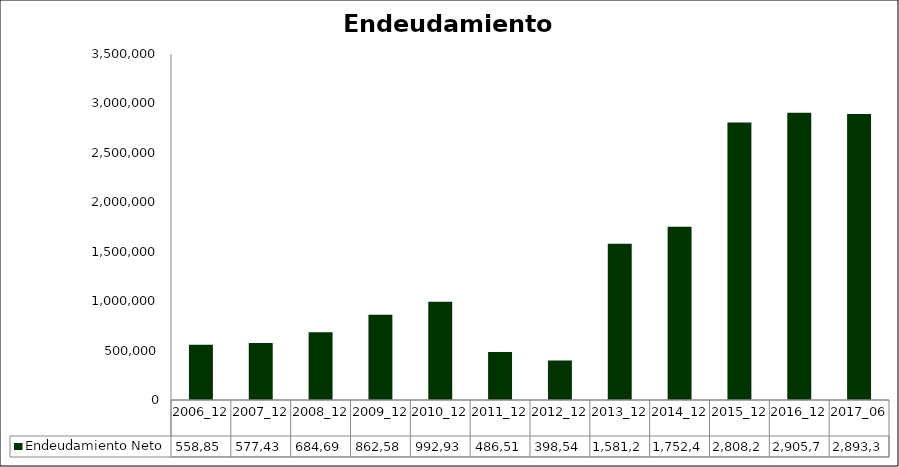
| Category | Endeudamiento Neto  |
|---|---|
| 2006_12 | 558856 |
| 2007_12 | 577437 |
| 2008_12 | 684694 |
| 2009_12 | 862585 |
| 2010_12 | 992937.025 |
| 2011_12 | 486511.217 |
| 2012_12 | 398541.553 |
| 2013_12 | 1581259.56 |
| 2014_12 | 1752414 |
| 2015_12 | 2808200.343 |
| 2016_12 | 2905796.075 |
| 2017_06 | 2893308.795 |